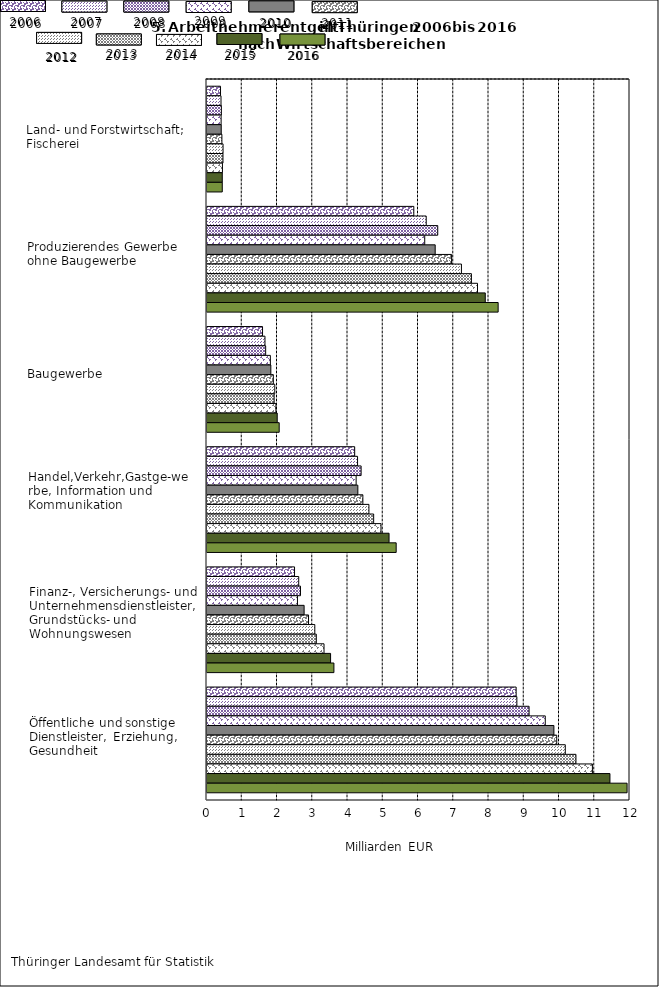
| Category | Series 0 | Series 1 | Series 2 | Series 3 | Series 4 | Series 5 | Series 6 | Series 7 | Series 8 | Series 9 | Series 10 |
|---|---|---|---|---|---|---|---|---|---|---|---|
| Land-und Forstwirtschaft; Fischerei | 0.384 | 0.397 | 0.407 | 0.4 | 0.404 | 0.423 | 0.455 | 0.453 | 0.438 | 0.433 | 0.433 |
| Produzierendes Gewerbe ohne Baugewerbe | 5.867 | 6.219 | 6.546 | 6.177 | 6.474 | 6.939 | 7.218 | 7.501 | 7.674 | 7.894 | 8.26 |
| Baugewerbe | 1.575 | 1.645 | 1.664 | 1.798 | 1.811 | 1.881 | 1.922 | 1.905 | 1.955 | 1.992 | 2.048 |
| Handel, Verkehr, Gastgewerbe, Information und Kommunikation | 4.189 | 4.271 | 4.372 | 4.231 | 4.28 | 4.422 | 4.593 | 4.728 | 4.936 | 5.165 | 5.367 |
| Finanz-, Versicherungs- und Unternehmensdienstl., Grundstücks- und Wohnungswesen | 2.483 | 2.602 | 2.652 | 2.566 | 2.755 | 2.881 | 3.058 | 3.101 | 3.32 | 3.506 | 3.6 |
| Öffentliche und sonstige Dienstleister, Erziehung, Gesundheit | 8.77 | 8.791 | 9.137 | 9.596 | 9.841 | 9.921 | 10.165 | 10.467 | 10.934 | 11.431 | 11.917 |